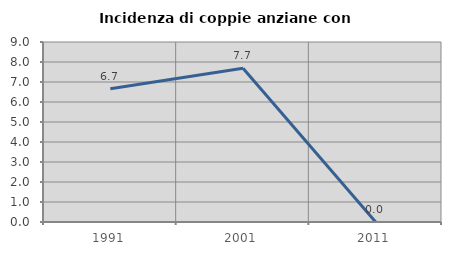
| Category | Incidenza di coppie anziane con figli |
|---|---|
| 1991.0 | 6.667 |
| 2001.0 | 7.692 |
| 2011.0 | 0 |